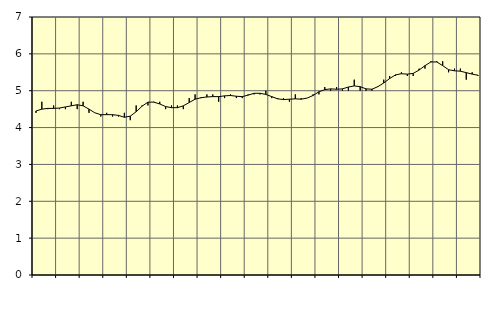
| Category | Piggar | Personliga och kulturella tjänster, SNI 90-98 |
|---|---|---|
| nan | 4.4 | 4.45 |
| 1.0 | 4.7 | 4.5 |
| 1.0 | 4.5 | 4.52 |
| 1.0 | 4.6 | 4.52 |
| nan | 4.5 | 4.53 |
| 2.0 | 4.5 | 4.56 |
| 2.0 | 4.7 | 4.59 |
| 2.0 | 4.5 | 4.62 |
| nan | 4.7 | 4.59 |
| 3.0 | 4.4 | 4.5 |
| 3.0 | 4.4 | 4.4 |
| 3.0 | 4.3 | 4.35 |
| nan | 4.4 | 4.35 |
| 4.0 | 4.3 | 4.35 |
| 4.0 | 4.3 | 4.33 |
| 4.0 | 4.4 | 4.28 |
| nan | 4.2 | 4.31 |
| 5.0 | 4.6 | 4.43 |
| 5.0 | 4.6 | 4.58 |
| 5.0 | 4.6 | 4.69 |
| nan | 4.7 | 4.69 |
| 6.0 | 4.7 | 4.64 |
| 6.0 | 4.5 | 4.57 |
| 6.0 | 4.6 | 4.54 |
| nan | 4.6 | 4.54 |
| 7.0 | 4.5 | 4.59 |
| 7.0 | 4.8 | 4.68 |
| 7.0 | 4.9 | 4.77 |
| nan | 4.8 | 4.81 |
| 8.0 | 4.9 | 4.83 |
| 8.0 | 4.9 | 4.84 |
| 8.0 | 4.7 | 4.84 |
| nan | 4.8 | 4.86 |
| 9.0 | 4.9 | 4.87 |
| 9.0 | 4.8 | 4.85 |
| 9.0 | 4.8 | 4.84 |
| nan | 4.9 | 4.88 |
| 10.0 | 4.9 | 4.93 |
| 10.0 | 4.9 | 4.93 |
| 10.0 | 5 | 4.9 |
| nan | 4.8 | 4.84 |
| 11.0 | 4.8 | 4.78 |
| 11.0 | 4.8 | 4.76 |
| 11.0 | 4.7 | 4.77 |
| nan | 4.9 | 4.78 |
| 12.0 | 4.8 | 4.77 |
| 12.0 | 4.8 | 4.8 |
| 12.0 | 4.9 | 4.87 |
| nan | 4.9 | 4.97 |
| 13.0 | 5.1 | 5.03 |
| 13.0 | 5 | 5.05 |
| 13.0 | 5.1 | 5.04 |
| nan | 5 | 5.05 |
| 14.0 | 5 | 5.1 |
| 14.0 | 5.3 | 5.13 |
| 14.0 | 5 | 5.11 |
| nan | 5 | 5.05 |
| 15.0 | 5 | 5.04 |
| 15.0 | 5.1 | 5.11 |
| 15.0 | 5.3 | 5.21 |
| nan | 5.4 | 5.33 |
| 16.0 | 5.4 | 5.43 |
| 16.0 | 5.5 | 5.46 |
| 16.0 | 5.4 | 5.45 |
| nan | 5.4 | 5.47 |
| 17.0 | 5.6 | 5.56 |
| 17.0 | 5.6 | 5.68 |
| 17.0 | 5.8 | 5.78 |
| nan | 5.8 | 5.78 |
| 18.0 | 5.8 | 5.68 |
| 18.0 | 5.5 | 5.57 |
| 18.0 | 5.6 | 5.54 |
| nan | 5.6 | 5.53 |
| 19.0 | 5.3 | 5.49 |
| 19.0 | 5.5 | 5.45 |
| 19.0 | 5.4 | 5.42 |